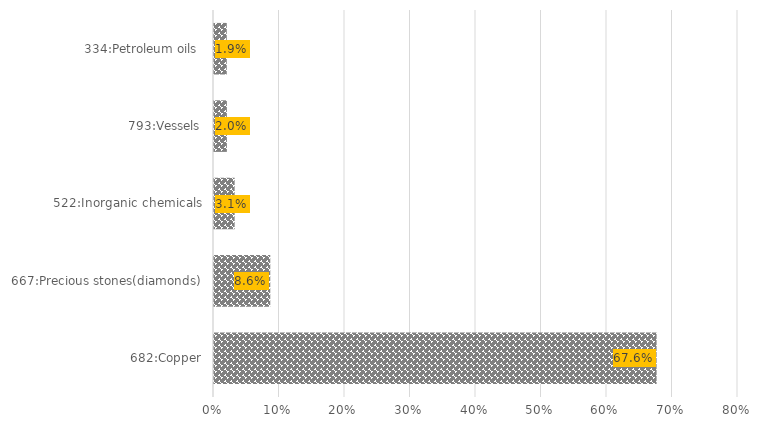
| Category | Apr-21 |
|---|---|
| 682:Copper | 0.676 |
| 667:Precious stones(diamonds) | 0.086 |
| 522:Inorganic chemicals | 0.031 |
| 793:Vessels | 0.02 |
| 334:Petroleum oils  | 0.019 |